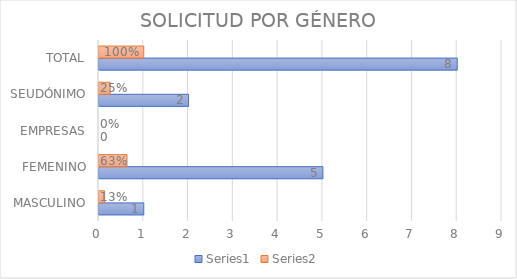
| Category | Series 0 | Series 1 |
|---|---|---|
| MASCULINO | 1 | 0.125 |
| FEMENINO | 5 | 0.625 |
| EMPRESAS | 0 | 0 |
| SEUDÓNIMO | 2 | 0.25 |
| TOTAL | 8 | 1 |